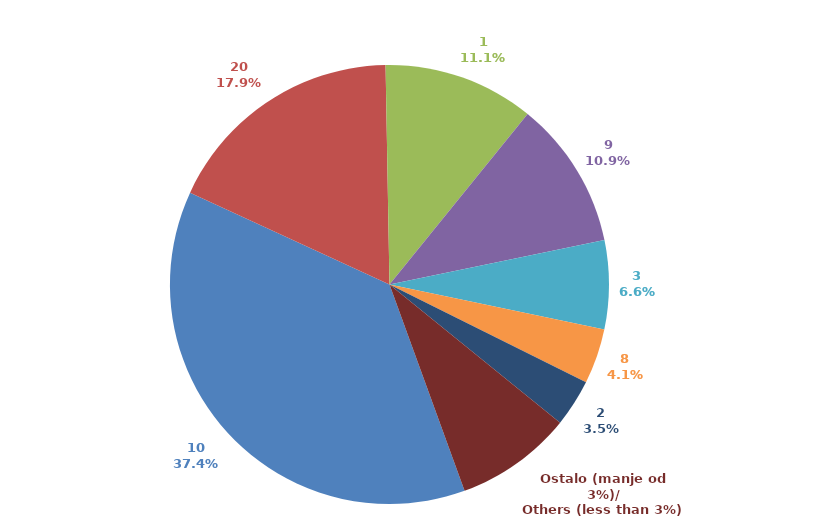
| Category | Series 0 |
|---|---|
| 10 | 0.374 |
| 20 | 0.178 |
| 1 | 0.111 |
| 9 | 0.109 |
| 3 | 0.065 |
| 8 | 0.041 |
| 2 | 0.035 |
| Ostalo (manje od 3%)/
Others (less than 3%) | 0.086 |